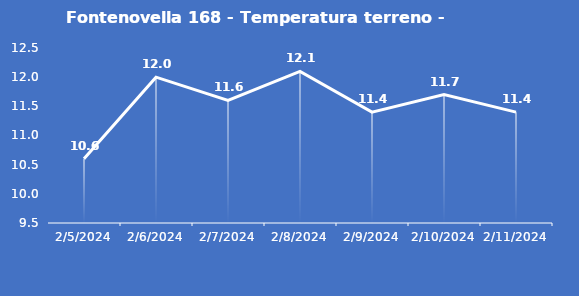
| Category | Fontenovella 168 - Temperatura terreno - Grezzo (°C) |
|---|---|
| 2/5/24 | 10.6 |
| 2/6/24 | 12 |
| 2/7/24 | 11.6 |
| 2/8/24 | 12.1 |
| 2/9/24 | 11.4 |
| 2/10/24 | 11.7 |
| 2/11/24 | 11.4 |